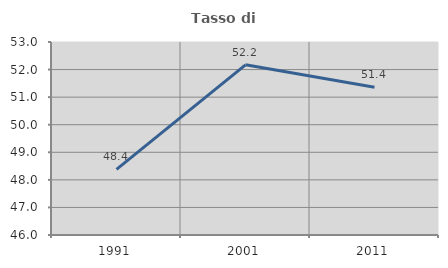
| Category | Tasso di occupazione   |
|---|---|
| 1991.0 | 48.377 |
| 2001.0 | 52.173 |
| 2011.0 | 51.362 |